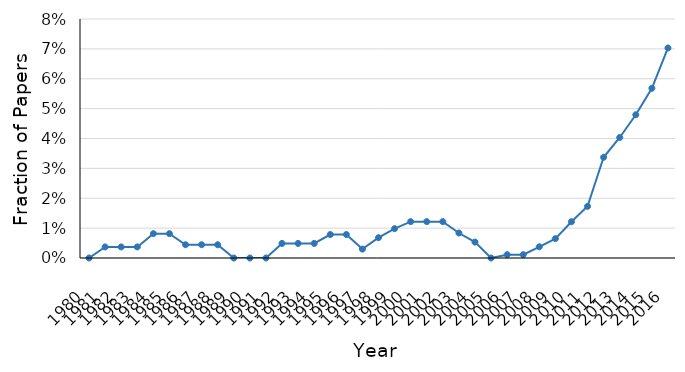
| Category | Sufficient Statistics |
|---|---|
| 1980.0 | 0 |
| 1981.0 | 0.004 |
| 1982.0 | 0.004 |
| 1983.0 | 0.004 |
| 1984.0 | 0.008 |
| 1985.0 | 0.008 |
| 1986.0 | 0.004 |
| 1987.0 | 0.004 |
| 1988.0 | 0.004 |
| 1989.0 | 0 |
| 1990.0 | 0 |
| 1991.0 | 0 |
| 1992.0 | 0.005 |
| 1993.0 | 0.005 |
| 1994.0 | 0.005 |
| 1995.0 | 0.008 |
| 1996.0 | 0.008 |
| 1997.0 | 0.003 |
| 1998.0 | 0.007 |
| 1999.0 | 0.01 |
| 2000.0 | 0.012 |
| 2001.0 | 0.012 |
| 2002.0 | 0.012 |
| 2003.0 | 0.008 |
| 2004.0 | 0.005 |
| 2005.0 | 0 |
| 2006.0 | 0.001 |
| 2007.0 | 0.001 |
| 2008.0 | 0.004 |
| 2009.0 | 0.006 |
| 2010.0 | 0.012 |
| 2011.0 | 0.017 |
| 2012.0 | 0.034 |
| 2013.0 | 0.04 |
| 2014.0 | 0.048 |
| 2015.0 | 0.057 |
| 2016.0 | 0.07 |